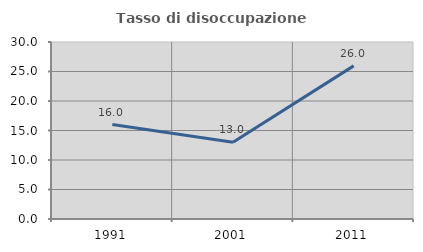
| Category | Tasso di disoccupazione giovanile  |
|---|---|
| 1991.0 | 16.013 |
| 2001.0 | 13.018 |
| 2011.0 | 25.952 |